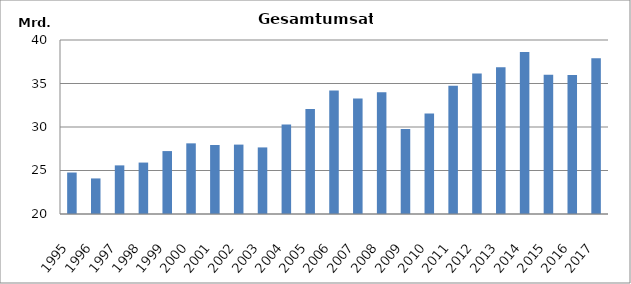
| Category | 1995 1996 1997 1998 1999 2000 2001 2002 2003 2004 2005 2006 2007 2008 2009 2010 2011 2012 2013 2014 2015 2016 2017 |
|---|---|
| 1995 | 24767994 |
| 1996 | 24088396 |
| 1997 | 25588482 |
| 1998 | 25911875 |
| 1999 | 27231996 |
| 2000 | 28121089 |
| 2001 | 27932719 |
| 2002 | 27976228 |
| 2003 | 27652647 |
| 2004 | 30278000 |
| 2005 | 32080721 |
| 2006 | 34189922 |
| 2007 | 33278221 |
| 2008 | 33993013 |
| 2009 | 29783049 |
| 2010 | 31557474.731 |
| 2011 | 34741088 |
| 2012 | 36149532 |
| 2013 | 36865320 |
| 2014 | 38623233 |
| 2015 | 36018872 |
| 2016 | 35975244 |
| 2017 | 37901736 |